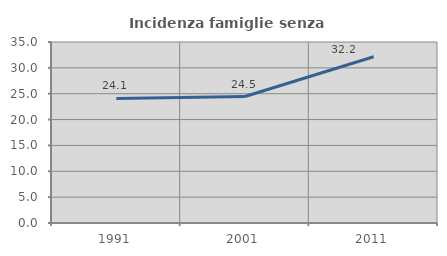
| Category | Incidenza famiglie senza nuclei |
|---|---|
| 1991.0 | 24.097 |
| 2001.0 | 24.458 |
| 2011.0 | 32.158 |